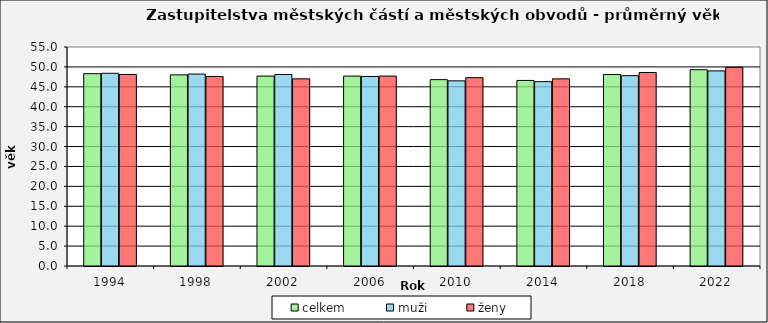
| Category | celkem | muži | ženy |
|---|---|---|---|
| 1994.0 | 48.3 | 48.4 | 48.1 |
| 1998.0 | 48 | 48.2 | 47.6 |
| 2002.0 | 47.7 | 48.1 | 47 |
| 2006.0 | 47.7 | 47.6 | 47.7 |
| 2010.0 | 46.8 | 46.5 | 47.3 |
| 2014.0 | 46.6 | 46.3 | 47 |
| 2018.0 | 48.1 | 47.8 | 48.6 |
| 2022.0 | 49.3 | 49 | 49.9 |